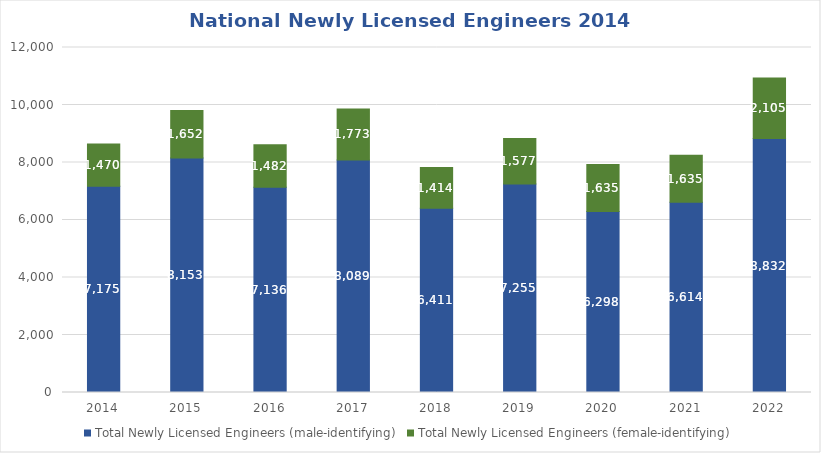
| Category | Total Newly Licensed Engineers (male-identifying) | Total Newly Licensed Engineers (female-identifying) |
|---|---|---|
| 2014.0 | 7175 | 1470 |
| 2015.0 | 8153 | 1652 |
| 2016.0 | 7136 | 1482 |
| 2017.0 | 8089 | 1773 |
| 2018.0 | 6411 | 1414 |
| 2019.0 | 7255 | 1577 |
| 2020.0 | 6298 | 1635 |
| 2021.0 | 6614 | 1635 |
| 2022.0 | 8832 | 2105 |